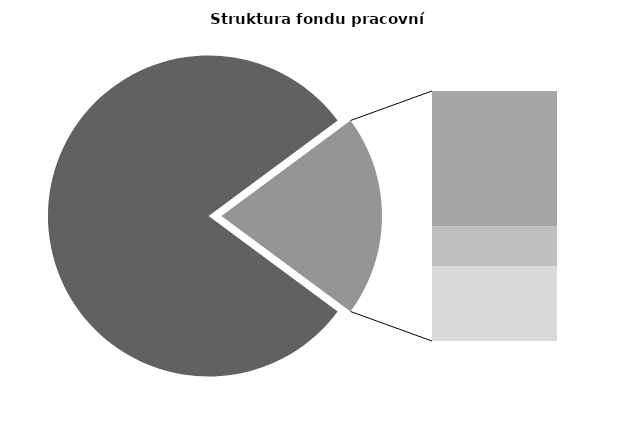
| Category | Series 0 |
|---|---|
| Průměrná měsíční odpracovaná doba bez přesčasu | 137.396 |
| Dovolená | 18.931 |
| Nemoc | 5.601 |
| Jiné | 10.408 |